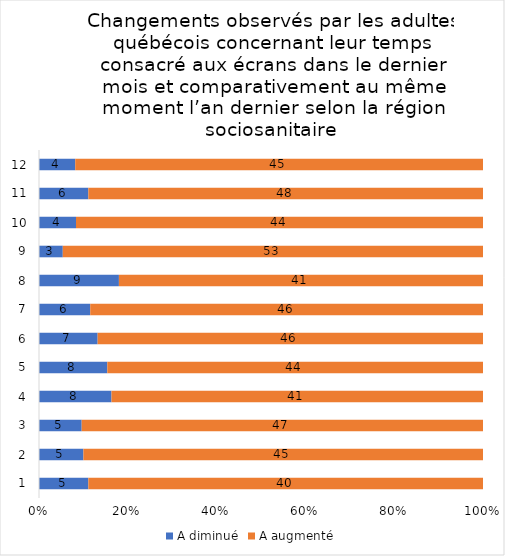
| Category | A diminué | A augmenté |
|---|---|---|
| 0 | 5 | 40 |
| 1 | 5 | 45 |
| 2 | 5 | 47 |
| 3 | 8 | 41 |
| 4 | 8 | 44 |
| 5 | 7 | 46 |
| 6 | 6 | 46 |
| 7 | 9 | 41 |
| 8 | 3 | 53 |
| 9 | 4 | 44 |
| 10 | 6 | 48 |
| 11 | 4 | 45 |